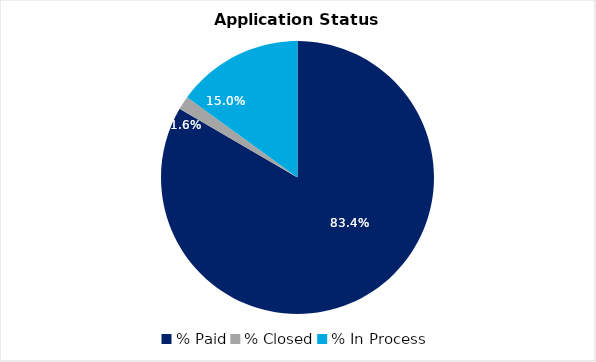
| Category | Series 0 |
|---|---|
| % Paid | 0.834 |
| % Closed | 0.016 |
| % In Process | 0.15 |